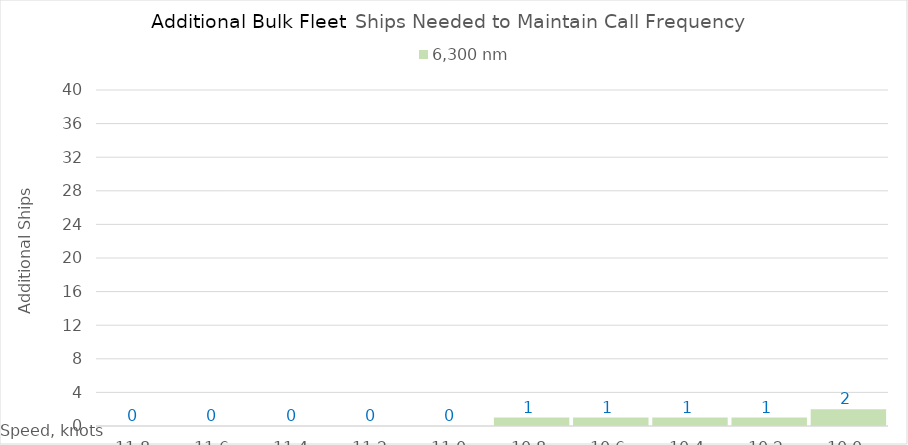
| Category | 6,300 |
|---|---|
| 11.8 | 0 |
| 11.600000000000001 | 0 |
| 11.400000000000002 | 0 |
| 11.200000000000003 | 0 |
| 11.000000000000004 | 0 |
| 10.800000000000004 | 1 |
| 10.600000000000005 | 1 |
| 10.400000000000006 | 1 |
| 10.200000000000006 | 1 |
| 10.000000000000007 | 2 |